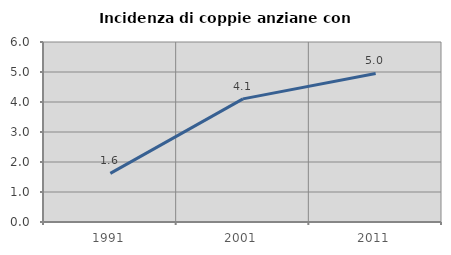
| Category | Incidenza di coppie anziane con figli |
|---|---|
| 1991.0 | 1.62 |
| 2001.0 | 4.104 |
| 2011.0 | 4.95 |